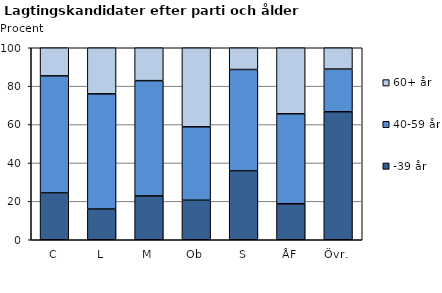
| Category | -39 år | 40-59 år | 60+ år |
|---|---|---|---|
| C | 24.39 | 60.976 | 14.634 |
| L | 16 | 60 | 24 |
| M | 22.857 | 60 | 17.143 |
| Ob | 20.588 | 38.235 | 41.176 |
| S | 35.849 | 52.83 | 11.321 |
| ÅF | 18.75 | 46.875 | 34.375 |
| Övr. | 66.667 | 22.222 | 11.111 |